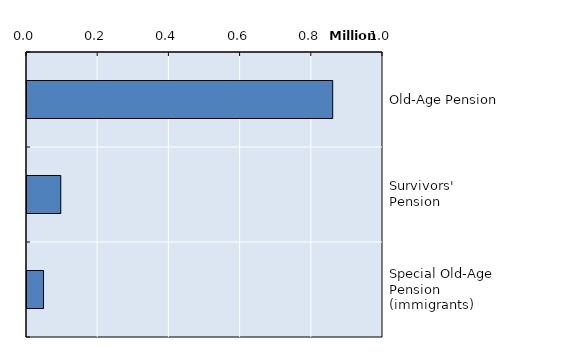
| Category | Series 0 |
|---|---|
| Old-Age Pension | 858682 |
| Survivors' Pension | 94887 |
| Special Old-Age Pension (immigrants) | 46461 |